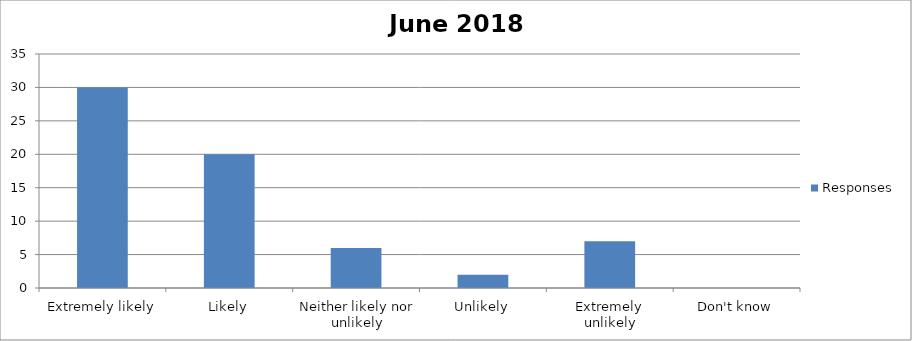
| Category | Responses |
|---|---|
| Extremely likely | 30 |
| Likely | 20 |
| Neither likely nor unlikely | 6 |
| Unlikely | 2 |
| Extremely unlikely | 7 |
| Don't know | 0 |